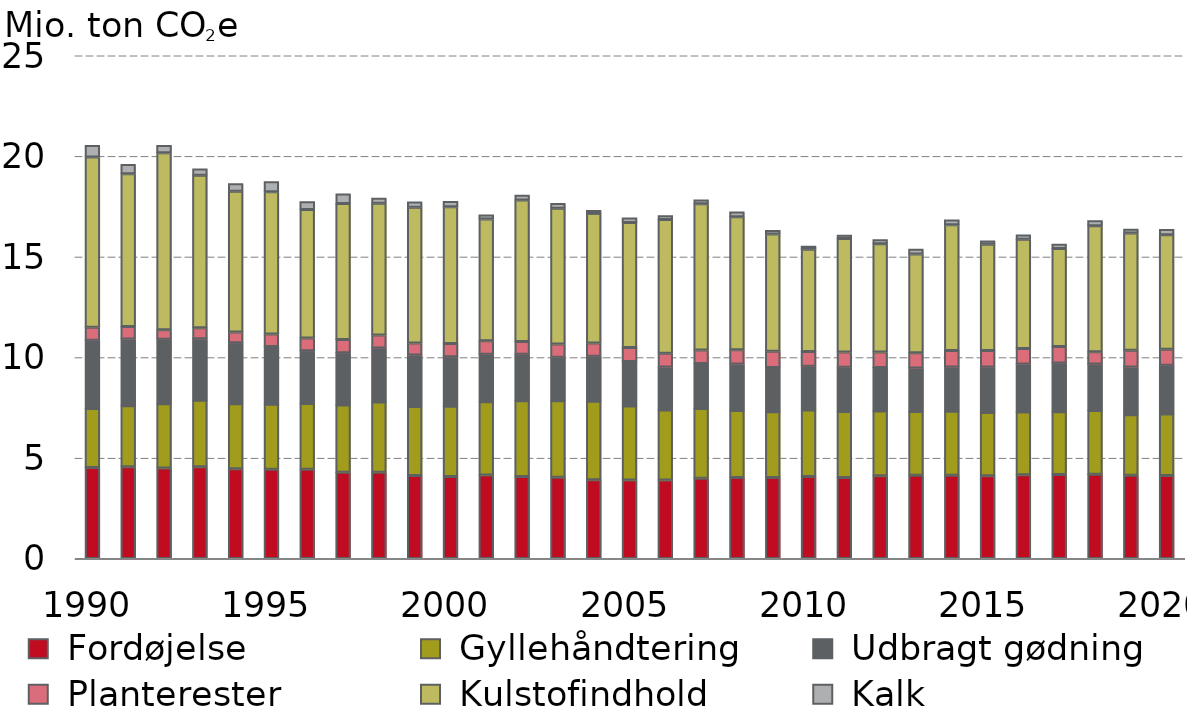
| Category |  Fordøjelse |  Gyllehåndtering |  Udbragt gødning |  Planterester |  Kulstofindhold |  Kalk |
|---|---|---|---|---|---|---|
| 1990 | 4.52 | 2.94 | 3.388 | 0.652 | 8.457 | 0.57 |
| 1991 | 4.56 | 3.03 | 3.315 | 0.621 | 7.593 | 0.46 |
| 1992 | 4.5 | 3.19 | 3.21 | 0.475 | 8.787 | 0.36 |
| 1993 | 4.56 | 3.3 | 3.061 | 0.551 | 7.582 | 0.31 |
| 1994 | 4.46 | 3.23 | 3.036 | 0.535 | 6.993 | 0.37 |
| 1995 | 4.44 | 3.23 | 2.871 | 0.62 | 7.065 | 0.5 |
| 1996 | 4.44 | 3.26 | 2.63 | 0.624 | 6.391 | 0.39 |
| 1997 | 4.29 | 3.34 | 2.6 | 0.657 | 6.757 | 0.47 |
| 1998 | 4.29 | 3.49 | 2.684 | 0.647 | 6.544 | 0.25 |
| 1999 | 4.13 | 3.42 | 2.559 | 0.603 | 6.743 | 0.26 |
| 2000 | 4.07 | 3.5 | 2.46 | 0.656 | 6.792 | 0.26 |
| 2001 | 4.15 | 3.64 | 2.36 | 0.672 | 6.046 | 0.2 |
| 2002 | 4.08 | 3.76 | 2.312 | 0.634 | 7.036 | 0.23 |
| 2003 | 4.04 | 3.8 | 2.162 | 0.658 | 6.754 | 0.23 |
| 2004 | 3.92 | 3.89 | 2.239 | 0.659 | 6.432 | 0.16 |
| 2005 | 3.9 | 3.68 | 2.211 | 0.693 | 6.216 | 0.22 |
| 2006 | 3.9 | 3.48 | 2.134 | 0.687 | 6.649 | 0.19 |
| 2007 | 3.99 | 3.46 | 2.246 | 0.662 | 7.271 | 0.19 |
| 2008 | 4.03 | 3.33 | 2.305 | 0.713 | 6.609 | 0.23 |
| 2009 | 4.03 | 3.26 | 2.206 | 0.799 | 5.831 | 0.18 |
| 2010 | 4.07 | 3.31 | 2.177 | 0.734 | 5.075 | 0.15 |
| 2011 | 4.02 | 3.29 | 2.196 | 0.753 | 5.645 | 0.16 |
| 2012 | 4.11 | 3.22 | 2.163 | 0.767 | 5.389 | 0.19 |
| 2013 | 4.14 | 3.16 | 2.165 | 0.758 | 4.908 | 0.24 |
| 2014 | 4.14 | 3.18 | 2.196 | 0.822 | 6.245 | 0.24 |
| 2015 | 4.11 | 3.15 | 2.261 | 0.812 | 5.28 | 0.17 |
| 2016 | 4.16 | 3.12 | 2.386 | 0.772 | 5.429 | 0.21 |
| 2017 | 4.18 | 3.11 | 2.432 | 0.811 | 4.88 | 0.21 |
| 2018 | 4.19 | 3.16 | 2.318 | 0.603 | 6.271 | 0.24 |
| 2019 | 4.14 | 3.01 | 2.363 | 0.836 | 5.83 | 0.18 |
| 2020 | 4.12 | 3.06 | 2.423 | 0.792 | 5.7 | 0.25 |